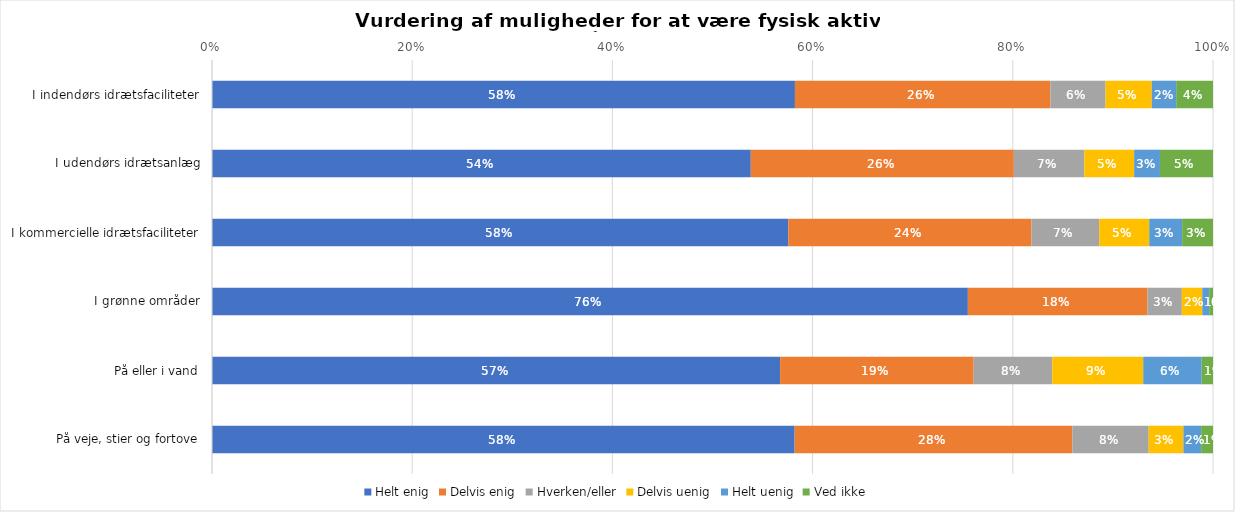
| Category | Helt enig | Delvis enig | Hverken/eller | Delvis uenig | Helt uenig | Ved ikke |
|---|---|---|---|---|---|---|
| I indendørs idrætsfaciliteter | 0.582 | 0.255 | 0.055 | 0.046 | 0.024 | 0.037 |
| I udendørs idrætsanlæg | 0.538 | 0.263 | 0.07 | 0.05 | 0.026 | 0.053 |
| I kommercielle idrætsfaciliteter | 0.576 | 0.243 | 0.068 | 0.05 | 0.033 | 0.031 |
| I grønne områder | 0.755 | 0.18 | 0.034 | 0.02 | 0.007 | 0.004 |
| På eller i vand | 0.568 | 0.193 | 0.078 | 0.091 | 0.058 | 0.011 |
| På veje, stier og fortove | 0.582 | 0.277 | 0.076 | 0.035 | 0.018 | 0.012 |